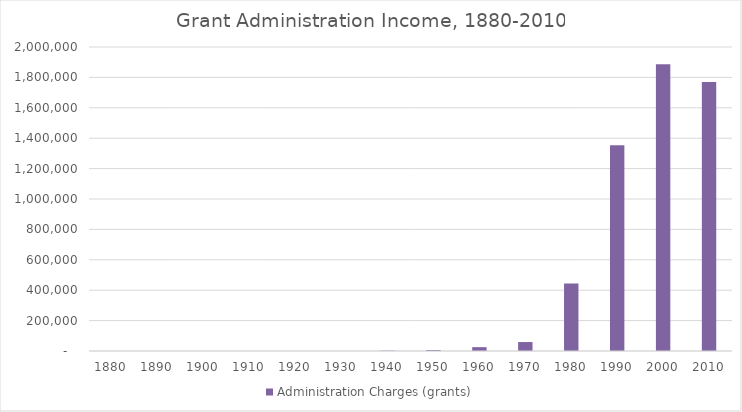
| Category | Administration Charges (grants) |
|---|---|
| 1880.0 | 0 |
| 1890.0 | 0 |
| 1900.0 | 0 |
| 1910.0 | 0 |
| 1920.0 | 0 |
| 1930.0 | 0 |
| 1940.0 | 2317.033 |
| 1950.0 | 6584.808 |
| 1960.0 | 25341 |
| 1970.0 | 58879 |
| 1980.0 | 444193 |
| 1990.0 | 1354405 |
| 2000.0 | 1886000 |
| 2010.0 | 1770000 |